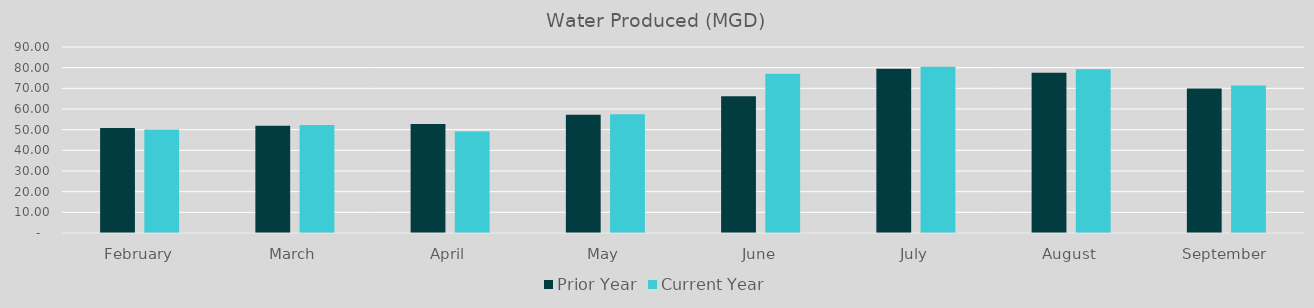
| Category | Prior Year | Current Year |
|---|---|---|
| February | 50.84 | 50.11 |
| March | 51.85 | 52.27 |
| April | 52.78 | 49.07 |
| May | 57.16 | 57.41 |
| June | 66.11 | 77.05 |
| July | 79.53 | 80.48 |
| August | 77.55 | 79.29 |
| September | 69.93 | 71.41 |